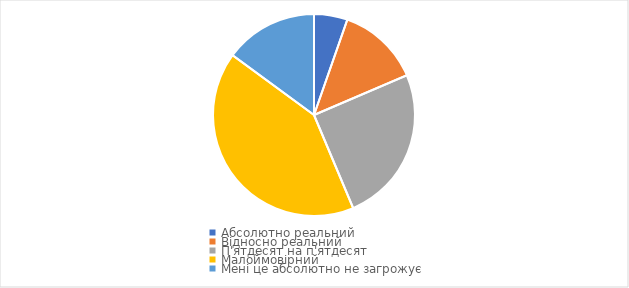
| Category | 18-24 роки |
|---|---|
| Абсолютно реальний | 0.054 |
| Відносно реальний | 0.132 |
| П'ятдесят на п'ятдесят | 0.251 |
| Малоймовірний | 0.414 |
| Мені це абсолютно не загрожує | 0.149 |